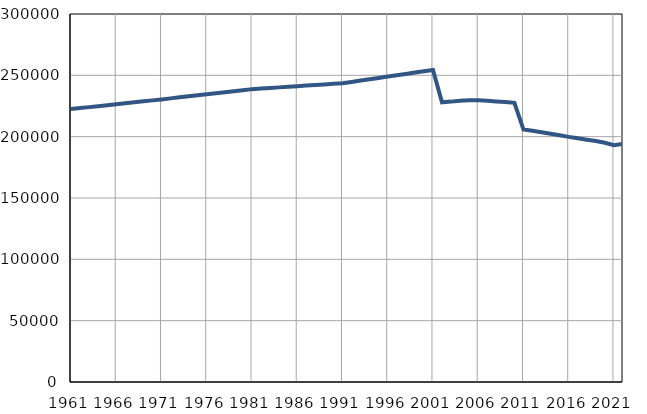
| Category | Број
становника |
|---|---|
| 1961.0 | 222520 |
| 1962.0 | 223305 |
| 1963.0 | 224091 |
| 1964.0 | 224876 |
| 1965.0 | 225661 |
| 1966.0 | 226447 |
| 1967.0 | 227232 |
| 1968.0 | 228017 |
| 1969.0 | 228802 |
| 1970.0 | 229588 |
| 1971.0 | 230373 |
| 1972.0 | 231211 |
| 1973.0 | 232049 |
| 1974.0 | 232887 |
| 1975.0 | 233725 |
| 1976.0 | 234563 |
| 1977.0 | 235401 |
| 1978.0 | 236239 |
| 1979.0 | 237077 |
| 1980.0 | 237915 |
| 1981.0 | 238753 |
| 1982.0 | 239231 |
| 1983.0 | 239708 |
| 1984.0 | 240186 |
| 1985.0 | 240663 |
| 1986.0 | 241141 |
| 1987.0 | 241619 |
| 1988.0 | 242096 |
| 1989.0 | 242574 |
| 1990.0 | 243051 |
| 1991.0 | 243529 |
| 1992.0 | 244617 |
| 1993.0 | 245706 |
| 1994.0 | 246794 |
| 1995.0 | 247882 |
| 1996.0 | 248970 |
| 1997.0 | 250059 |
| 1998.0 | 251147 |
| 1999.0 | 252235 |
| 2000.0 | 253323 |
| 2001.0 | 254412 |
| 2002.0 | 227962 |
| 2003.0 | 228574 |
| 2004.0 | 229361 |
| 2005.0 | 229707 |
| 2006.0 | 229596 |
| 2007.0 | 229200 |
| 2008.0 | 228704 |
| 2009.0 | 228254 |
| 2010.0 | 227554 |
| 2011.0 | 205811 |
| 2012.0 | 204748 |
| 2013.0 | 203577 |
| 2014.0 | 202425 |
| 2015.0 | 201170 |
| 2016.0 | 199849 |
| 2017.0 | 198671 |
| 2018.0 | 197538 |
| 2019.0 | 196431 |
| 2020.0 | 195041 |
| 2021.0 | 193073 |
| 2022.0 | 194208 |